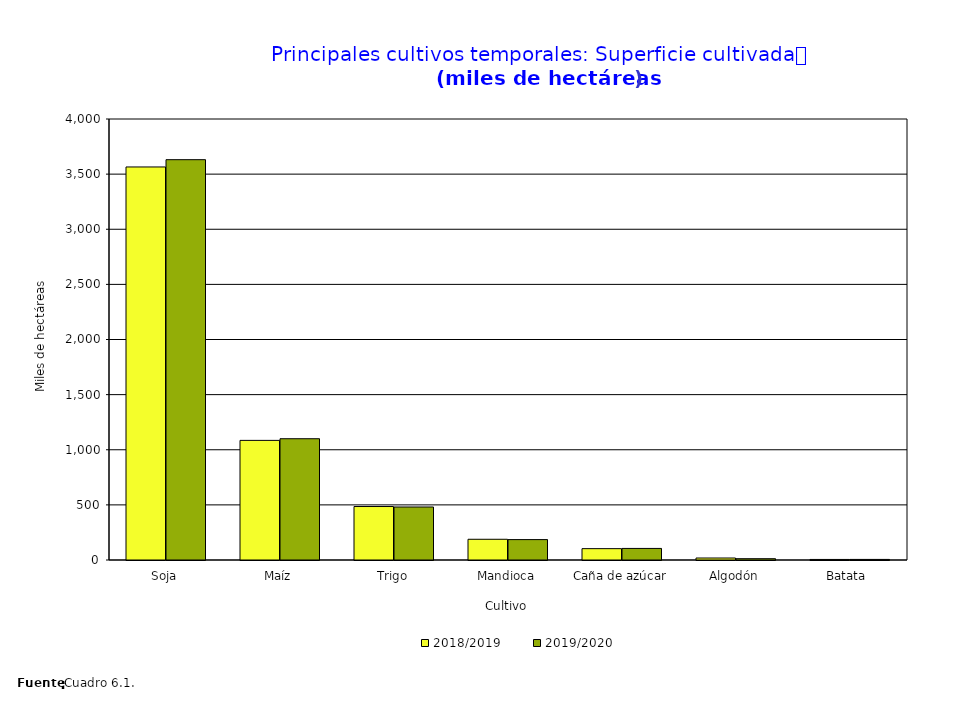
| Category | 2018/2019 | 2019/2020 |
|---|---|---|
| Soja | 3565 | 3631 |
| Maíz | 1085 | 1100 |
| Trigo | 485 | 480.8 |
| Mandioca | 188 | 185 |
| Caña de azúcar | 103 | 105 |
| Algodón | 18 | 11.8 |
| Batata  | 5.087 | 5.271 |